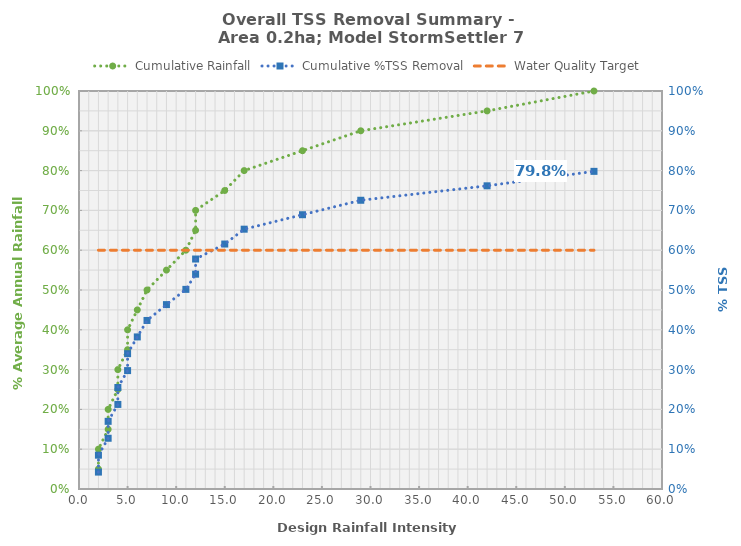
| Category | Cumulative Rainfall |
|---|---|
| 2.0 | 0.05 |
| 2.0 | 0.1 |
| 3.0 | 0.15 |
| 3.0 | 0.2 |
| 4.0 | 0.25 |
| 4.0 | 0.3 |
| 5.0 | 0.35 |
| 5.0 | 0.4 |
| 6.0 | 0.45 |
| 7.0 | 0.5 |
| 9.0 | 0.55 |
| 11.0 | 0.6 |
| 12.0 | 0.65 |
| 12.0 | 0.7 |
| 15.0 | 0.75 |
| 17.0 | 0.8 |
| 23.0 | 0.85 |
| 29.0 | 0.9 |
| 42.0 | 0.95 |
| 53.0 | 1 |